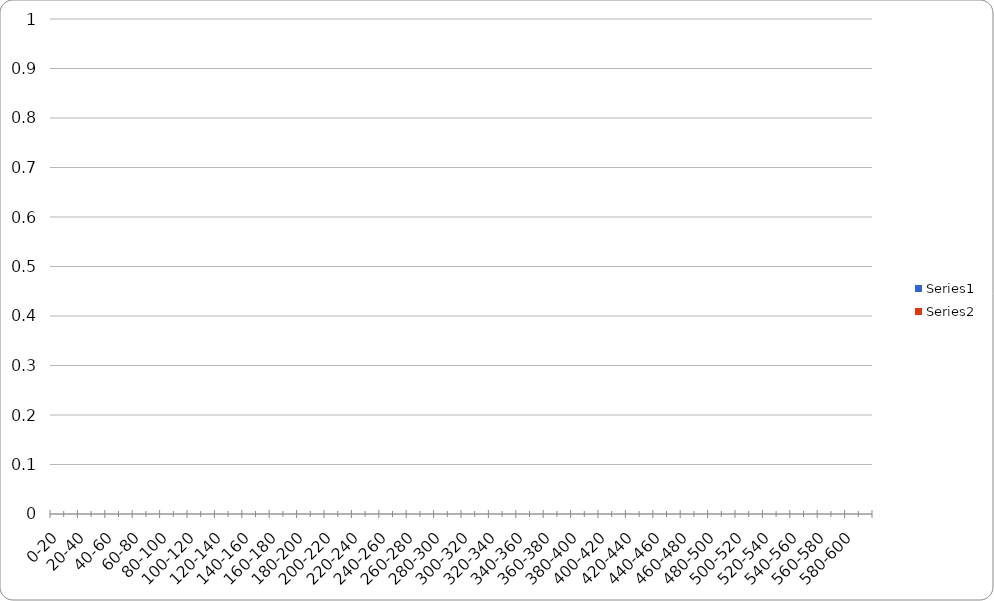
| Category | Series 0 | Series 1 |
|---|---|---|
| 0-20 | 0 | 0 |
| 20-40 | 0 | 0 |
| 40-60 | 0 | 0 |
| 60-80 | 0 | 0 |
| 80-100 | 0 | 0 |
| 100-120 | 0 | 0 |
| 120-140 | 0 | 0 |
| 140-160 | 0 | 0 |
| 160-180 | 0 | 0 |
| 180-200 | 0 | 0 |
| 200-220 | 0 | 0 |
| 220-240 | 0 | 0 |
| 240-260 | 0 | 0 |
| 260-280 | 0 | 0 |
| 280-300 | 0 | 0 |
| 300-320 | 0 | 0 |
| 320-340 | 0 | 0 |
| 340-360 | 0 | 0 |
| 360-380 | 0 | 0 |
| 380-400 | 0 | 0 |
| 400-420 | 0 | 0 |
| 420-440 | 0 | 0 |
| 440-460 | 0 | 0 |
| 460-480 | 0 | 0 |
| 480-500 | 0 | 0 |
| 500-520 | 0 | 0 |
| 520-540 | 0 | 0 |
| 540-560 | 0 | 0 |
| 560-580 | 0 | 0 |
| 580-600 | 0 | 0 |